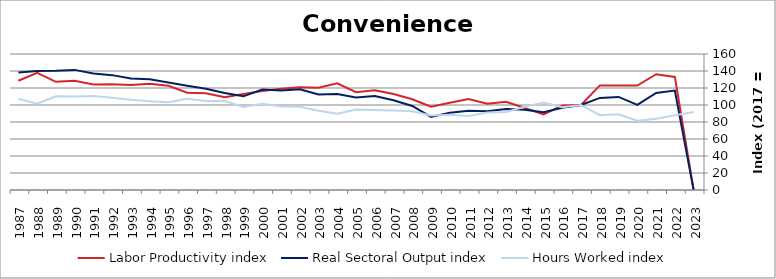
| Category | Labor Productivity index | Real Sectoral Output index | Hours Worked index |
|---|---|---|---|
| 2023.0 | 0 | 0 | 91.886 |
| 2022.0 | 133.042 | 116.958 | 87.911 |
| 2021.0 | 136.205 | 114.089 | 83.763 |
| 2020.0 | 122.816 | 100.233 | 81.612 |
| 2019.0 | 123.004 | 109.534 | 89.049 |
| 2018.0 | 123.031 | 108.372 | 88.085 |
| 2017.0 | 100 | 100 | 100 |
| 2016.0 | 99.506 | 96.817 | 97.297 |
| 2015.0 | 88.862 | 91.506 | 102.975 |
| 2014.0 | 96.513 | 94.538 | 97.954 |
| 2013.0 | 103.857 | 95.209 | 91.674 |
| 2012.0 | 101.474 | 92.575 | 91.23 |
| 2011.0 | 107.11 | 93.221 | 87.033 |
| 2010.0 | 102.546 | 90.864 | 88.607 |
| 2009.0 | 98.057 | 86.007 | 87.711 |
| 2008.0 | 106.68 | 98.881 | 92.69 |
| 2007.0 | 112.946 | 105.683 | 93.569 |
| 2006.0 | 117.378 | 110.552 | 94.185 |
| 2005.0 | 115.082 | 108.897 | 94.625 |
| 2004.0 | 125.602 | 112.813 | 89.818 |
| 2003.0 | 120.338 | 112.341 | 93.355 |
| 2002.0 | 120.951 | 118.568 | 98.03 |
| 2001.0 | 119.027 | 117.004 | 98.3 |
| 2000.0 | 116.464 | 118.293 | 101.57 |
| 1999.0 | 112.875 | 110.204 | 97.634 |
| 1998.0 | 109.009 | 114.17 | 104.734 |
| 1997.0 | 113.829 | 119.042 | 104.58 |
| 1996.0 | 114.477 | 122.773 | 107.247 |
| 1995.0 | 122.534 | 126.363 | 103.125 |
| 1994.0 | 124.943 | 130.42 | 104.384 |
| 1993.0 | 123.624 | 131.28 | 106.193 |
| 1992.0 | 124.491 | 135.136 | 108.551 |
| 1991.0 | 124.012 | 137.193 | 110.629 |
| 1990.0 | 128.628 | 141.309 | 109.858 |
| 1989.0 | 127.252 | 140.396 | 110.33 |
| 1988.0 | 137.966 | 140.119 | 101.561 |
| 1987.0 | 128.548 | 138.114 | 107.442 |